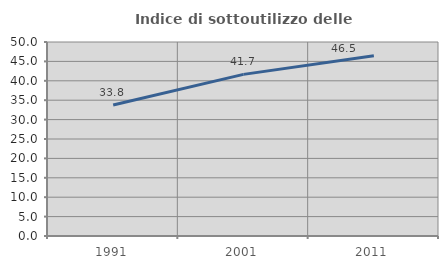
| Category | Indice di sottoutilizzo delle abitazioni  |
|---|---|
| 1991.0 | 33.752 |
| 2001.0 | 41.652 |
| 2011.0 | 46.471 |